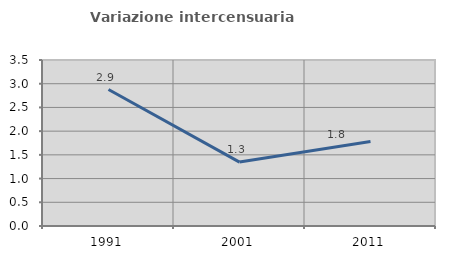
| Category | Variazione intercensuaria annua |
|---|---|
| 1991.0 | 2.877 |
| 2001.0 | 1.347 |
| 2011.0 | 1.783 |